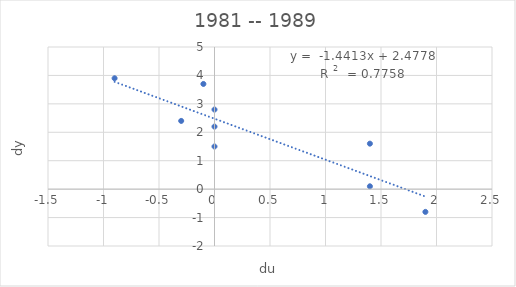
| Category | dy |
|---|---|
| 1.4 | 0.1 |
| 1.9000000000000004 | -0.8 |
| 1.3999999999999995 | 1.6 |
| 0.0 | 2.8 |
| 0.0 | 2.2 |
| -0.2999999999999998 | 2.4 |
| 0.0 | 1.5 |
| -0.09999999999999964 | 3.7 |
| -0.9000000000000004 | 3.9 |